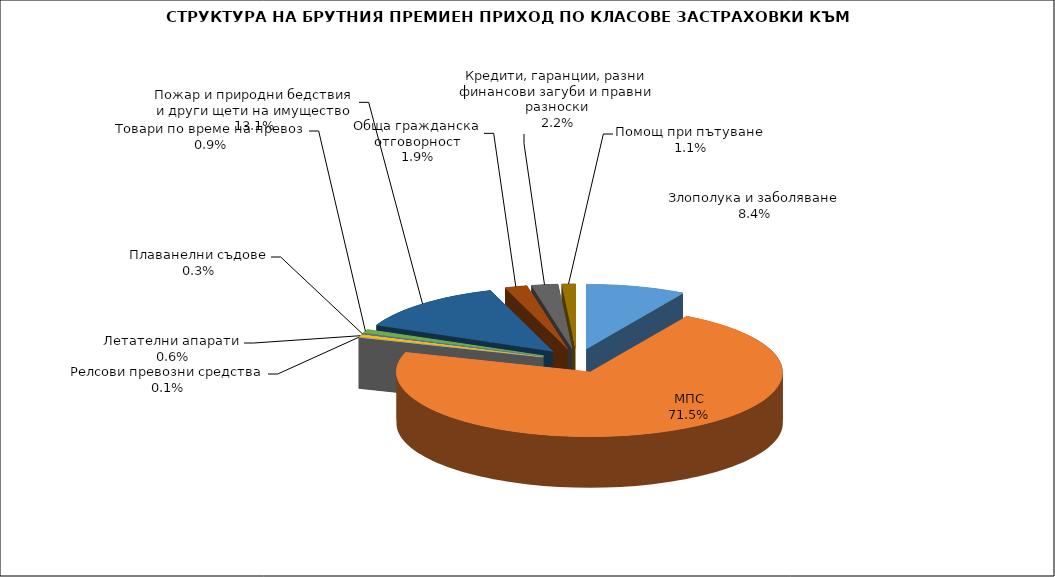
| Category | Злополука и заболяване |
|---|---|
| Злополука и заболяване | 0.084 |
| МПС | 0.715 |
| Релсови превозни средства | 0.001 |
| Летателни апарати | 0.006 |
| Плаванелни съдове | 0.003 |
| Товари по време на превоз | 0.009 |
| Пожар и природни бедствия и други щети на имущество | 0.131 |
| Обща гражданска отговорност | 0.019 |
| Кредити, гаранции, разни финансови загуби и правни разноски | 0.022 |
| Помощ при пътуване | 0.011 |